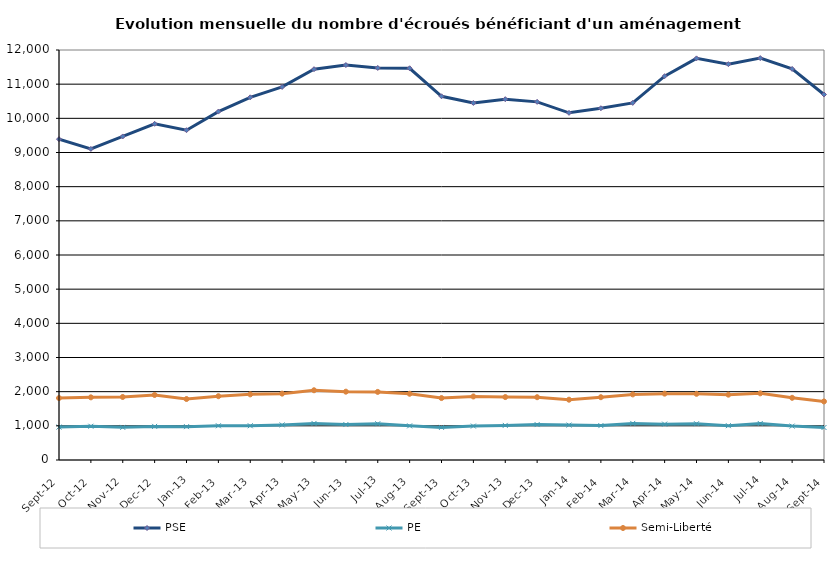
| Category | PSE | PE | Semi-Liberté |
|---|---|---|---|
| 2012-09-01 | 9390 | 964 | 1813 |
| 2012-10-01 | 9105 | 988 | 1834 |
| 2012-11-01 | 9470 | 955 | 1845 |
| 2012-12-01 | 9840 | 984 | 1903 |
| 2013-01-01 | 9653 | 976 | 1785 |
| 2013-02-01 | 10197 | 1002 | 1867 |
| 2013-03-01 | 10615 | 1002 | 1921 |
| 2013-04-01 | 10919 | 1027 | 1942 |
| 2013-05-01 | 11438 | 1070 | 2041 |
| 2013-06-01 | 11559 | 1038 | 2000 |
| 2013-07-01 | 11475 | 1061 | 1993 |
| 2013-08-01 | 11465 | 999 | 1939 |
| 2013-09-01 | 10646 | 954 | 1813 |
| 2013-10-01 | 10451 | 993 | 1860 |
| 2013-11-01 | 10560 | 1013 | 1842 |
| 2013-12-01 | 10482 | 1037 | 1838 |
| 2014-01-01 | 10161 | 1022 | 1765 |
| 2014-02-01 | 10296 | 1007 | 1838 |
| 2014-03-01 | 10452 | 1071 | 1920 |
| 2014-04-01 | 11234 | 1050 | 1942 |
| 2014-05-01 | 11755 | 1062 | 1937 |
| 2014-06-01 | 11586 | 1005 | 1912 |
| 2014-07-01 | 11763 | 1068 | 1951 |
| 2014-08-01 | 11447 | 992 | 1820 |
| 2014-09-01 | 10698 | 951 | 1714 |